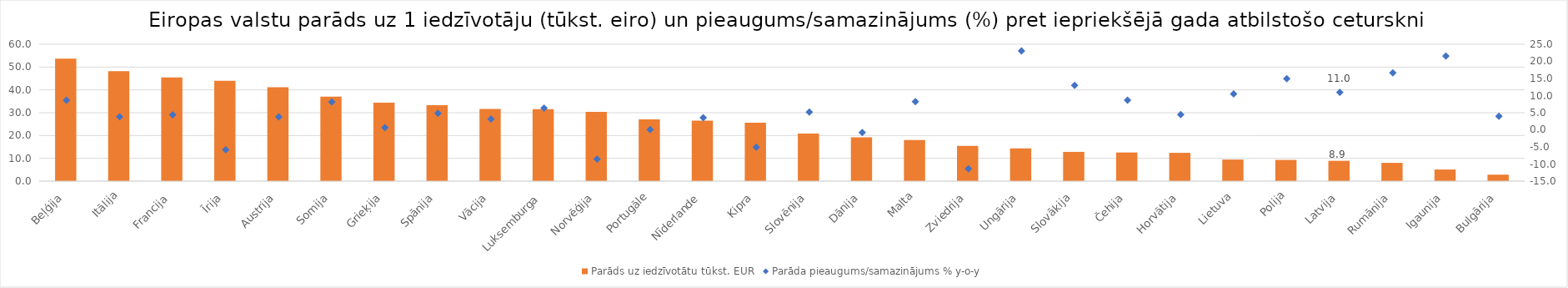
| Category | Parāds uz iedzīvotātu tūkst. EUR |
|---|---|
|  Beļģija | 53.701 |
| Itālija | 48.181 |
| Francija | 45.501 |
| Īrija | 43.985 |
| Austrija | 41.139 |
| Somija | 37.078 |
| Grieķija | 34.434 |
| Spānija | 33.253 |
| Vācija | 31.608 |
| Luksemburga | 31.538 |
| Norvēģija | 30.378 |
| Portugāle | 27.039 |
| Nīderlande | 26.543 |
| Kipra | 25.622 |
| Slovēnija | 20.842 |
| Dānija | 19.215 |
| Malta | 18.062 |
| Zviedrija | 15.421 |
| Ungārija | 14.393 |
| Slovākija | 12.822 |
| Čehija | 12.557 |
| Horvātija | 12.405 |
| Lietuva | 9.464 |
| Polija | 9.314 |
| Latvija | 8.924 |
| Rumānija | 8.013 |
| Igaunija | 5.098 |
| Bulgārija | 2.845 |